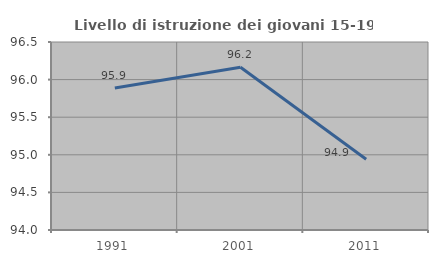
| Category | Livello di istruzione dei giovani 15-19 anni |
|---|---|
| 1991.0 | 95.888 |
| 2001.0 | 96.164 |
| 2011.0 | 94.94 |